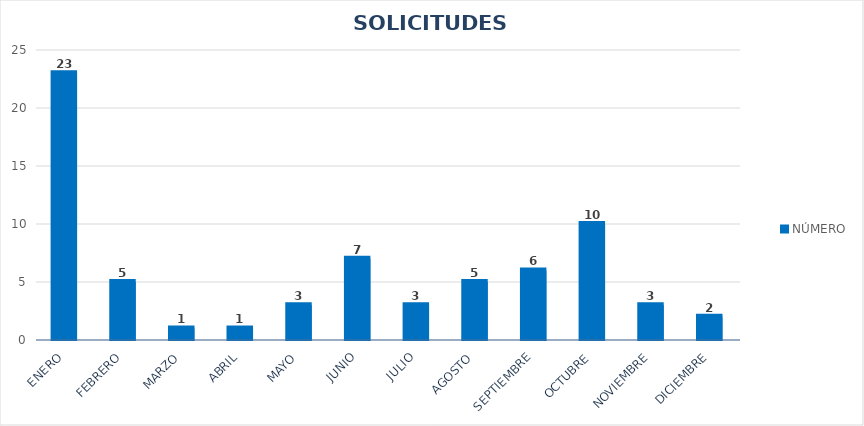
| Category | NÚMERO |
|---|---|
| Enero | 23 |
| Febrero | 5 |
| Marzo | 1 |
| Abril | 1 |
| Mayo | 3 |
| Junio | 7 |
| Julio | 3 |
| Agosto | 5 |
| Septiembre | 6 |
| Octubre | 10 |
| Noviembre | 3 |
| Diciembre | 2 |